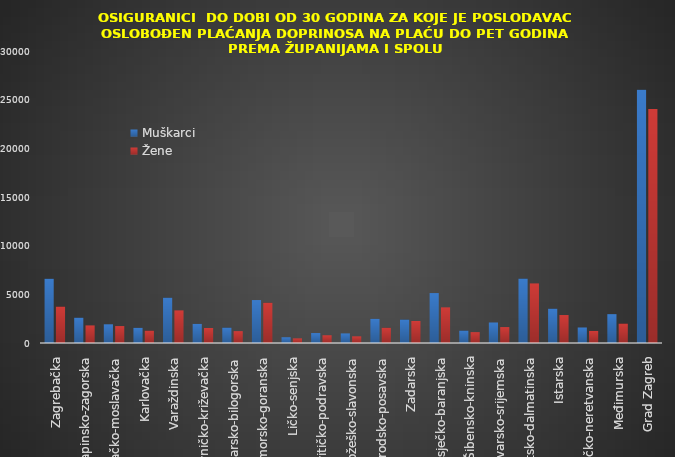
| Category | Muškarci | Žene |
|---|---|---|
| Zagrebačka | 6603 | 3742 |
| Krapinsko-zagorska | 2603 | 1807 |
| Sisačko-moslavačka | 1921 | 1740 |
| Karlovačka | 1560 | 1270 |
| Varaždinska | 4657 | 3352 |
| Koprivničko-križevačka | 1964 | 1539 |
| Bjelovarsko-bilogorska | 1585 | 1219 |
| Primorsko-goranska | 4413 | 4140 |
| Ličko-senjska | 592 | 476 |
| Virovitičko-podravska | 1022 | 796 |
| Požeško-slavonska | 986 | 686 |
| Brodsko-posavska | 2485 | 1567 |
| Zadarska | 2413 | 2263 |
| Osječko-baranjska | 5130 | 3662 |
| Šibensko-kninska | 1282 | 1116 |
| Vukovarsko-srijemska | 2107 | 1635 |
| Splitsko-dalmatinska | 6620 | 6121 |
| Istarska | 3529 | 2873 |
| Dubrovačko-neretvanska | 1594 | 1239 |
| Međimurska | 2964 | 1997 |
| Grad Zagreb | 26007 | 24037 |